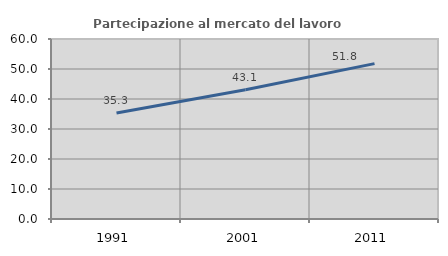
| Category | Partecipazione al mercato del lavoro  femminile |
|---|---|
| 1991.0 | 35.31 |
| 2001.0 | 43.111 |
| 2011.0 | 51.793 |